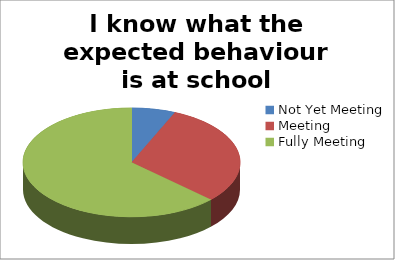
| Category | I know what the expected behaviour is at school |
|---|---|
| Not Yet Meeting | 3 |
| Meeting | 14 |
| Fully Meeting | 29 |